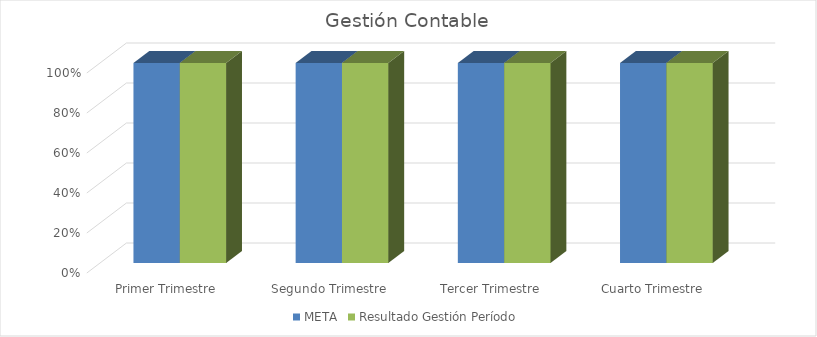
| Category | META | Resultado Gestión Período |
|---|---|---|
| Primer Trimestre | 1 | 1 |
| Segundo Trimestre | 1 | 1 |
| Tercer Trimestre | 1 | 1 |
| Cuarto Trimestre | 1 | 1 |